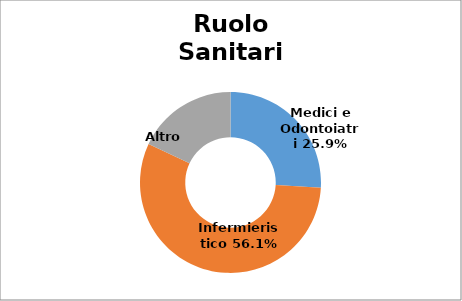
| Category | Series 0 |
|---|---|
| Medici e Odontoiatri | 0.259 |
| Infermieristico | 0.561 |
| Altro  | 0.18 |